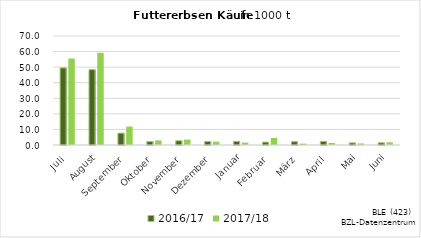
| Category | 2016/17 | 2017/18 |
|---|---|---|
| Juli | 49.523 | 55.536 |
| August | 48.366 | 59.217 |
| September | 7.605 | 11.849 |
| Oktober | 2.187 | 2.959 |
| November | 2.719 | 3.465 |
| Dezember | 2.236 | 2.136 |
| Januar | 2.315 | 1.519 |
| Februar | 1.856 | 4.524 |
| März | 2.156 | 0.873 |
| April | 2.295 | 1.301 |
| Mai | 1.352 | 0.995 |
| Juni | 1.423 | 1.721 |